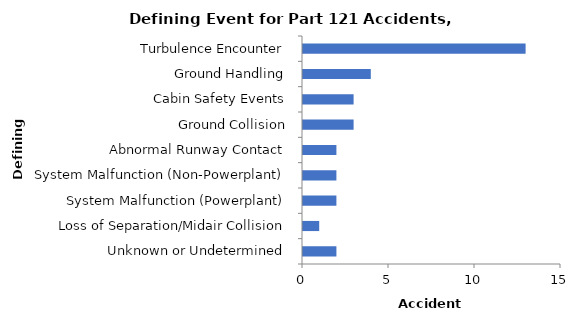
| Category | Accident Aircraft |
|---|---|
| Turbulence Encounter | 13 |
| Ground Handling | 4 |
| Cabin Safety Events | 3 |
| Ground Collision | 3 |
| Abnormal Runway Contact | 2 |
| System Malfunction (Non-Powerplant) | 2 |
| System Malfunction (Powerplant) | 2 |
| Loss of Separation/Midair Collision | 1 |
| Unknown or Undetermined | 2 |